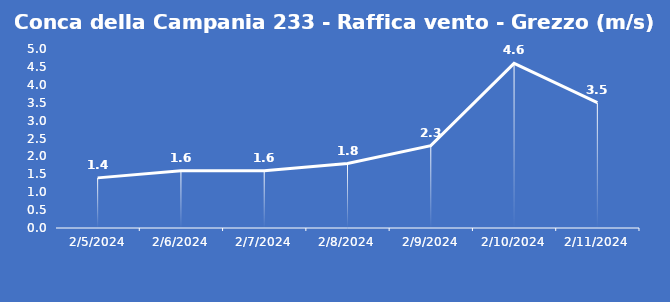
| Category | Conca della Campania 233 - Raffica vento - Grezzo (m/s) |
|---|---|
| 2/5/24 | 1.4 |
| 2/6/24 | 1.6 |
| 2/7/24 | 1.6 |
| 2/8/24 | 1.8 |
| 2/9/24 | 2.3 |
| 2/10/24 | 4.6 |
| 2/11/24 | 3.5 |